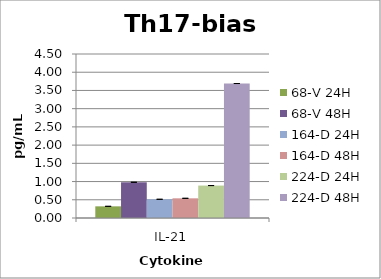
| Category | 68-A 24H | 68-A 48H | 68-V 24H | 68-V 48H | 139-A 24H | 139-A 48H | 164-D 24H | 164-D 48H | 224-D 24H | 224-D 48H |
|---|---|---|---|---|---|---|---|---|---|---|
| IL-21 |  |  | 0.32 | 0.98 |  |  | 0.513 | 0.54 | 0.89 | 3.69 |